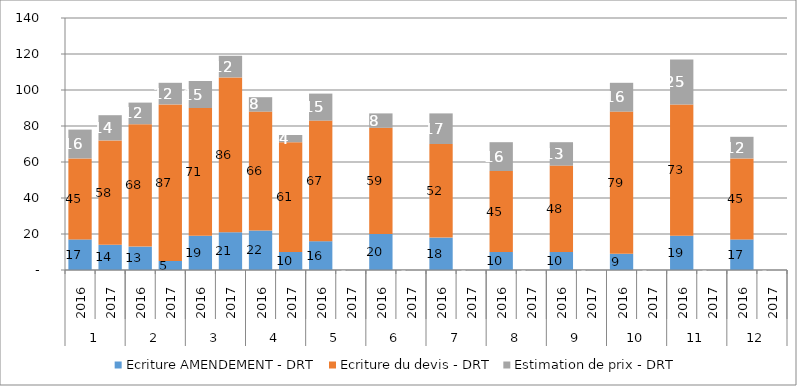
| Category | Ecriture AMENDEMENT - DRT | Ecriture du devis - DRT | Estimation de prix - DRT |
|---|---|---|---|
| 0 | 17 | 45 | 16 |
| 1 | 14 | 58 | 14 |
| 2 | 13 | 68 | 12 |
| 3 | 5 | 87 | 12 |
| 4 | 19 | 71 | 15 |
| 5 | 21 | 86 | 12 |
| 6 | 22 | 66 | 8 |
| 7 | 10 | 61 | 4 |
| 8 | 16 | 67 | 15 |
| 9 | 0 | 0 | 0 |
| 10 | 20 | 59 | 8 |
| 11 | 0 | 0 | 0 |
| 12 | 18 | 52 | 17 |
| 13 | 0 | 0 | 0 |
| 14 | 10 | 45 | 16 |
| 15 | 0 | 0 | 0 |
| 16 | 10 | 48 | 13 |
| 17 | 0 | 0 | 0 |
| 18 | 9 | 79 | 16 |
| 19 | 0 | 0 | 0 |
| 20 | 19 | 73 | 25 |
| 21 | 0 | 0 | 0 |
| 22 | 17 | 45 | 12 |
| 23 | 0 | 0 | 0 |